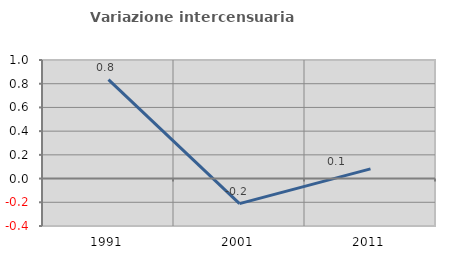
| Category | Variazione intercensuaria annua |
|---|---|
| 1991.0 | 0.835 |
| 2001.0 | -0.211 |
| 2011.0 | 0.082 |